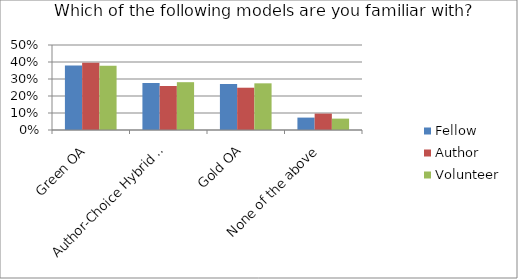
| Category | Fellow | Author | Volunteer |
|---|---|---|---|
| Green OA | 0.38 | 0.396 | 0.377 |
| Author-Choice Hybrid OA | 0.277 | 0.259 | 0.281 |
| Gold OA | 0.271 | 0.249 | 0.275 |
| None of the above | 0.073 | 0.096 | 0.067 |